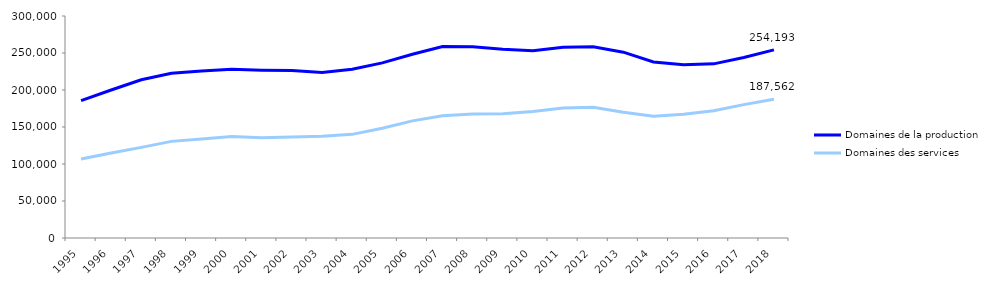
| Category | Domaines de la production | Domaines des services |
|---|---|---|
| 1995 | 185682 | 106784 |
| 1996 | 199995 | 114764 |
| 1997 | 213773 | 122488 |
| 1998 | 222570 | 130580 |
| 1999 | 225802 | 133903 |
| 2000 | 228114 | 137157 |
| 2001 | 226833 | 135458 |
| 2002 | 226307 | 136500 |
| 2003 | 223752 | 137457 |
| 2004 | 228140 | 140059 |
| 2005 | 236666 | 148351 |
| 2006 | 248317 | 158290 |
| 2007 | 258687 | 165089 |
| 2008 | 258550 | 167433 |
| 2009 | 255075 | 167790 |
| 2010 | 252983 | 171022 |
| 2011 | 257900 | 175823 |
| 2012 | 258548 | 176642 |
| 2013 | 251095 | 170059 |
| 2014 | 237932 | 164511 |
| 2015 | 234110 | 167257 |
| 2016 | 235325 | 172057 |
| 2017 | 243845 | 180262 |
| 2018 | 254193 | 187562 |